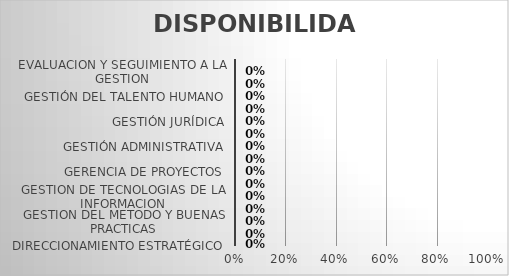
| Category | DISPONIBILIDAD |
|---|---|
| DIRECCIONAMIENTO ESTRATÉGICO | 0 |
| GESTIÓN DE PROVEEDORES | 0 |
| GESTION DEL METODO Y BUENAS PRACTICAS | 0 |
| GESTION DE COMUNICACIONES | 0 |
| GESTION DE TECNOLOGIAS DE LA INFORMACION | 0 |
| ESTRUCTURACION DE PROYECTOS | 0 |
| GERENCIA DE PROYECTOS | 0 |
| EVALUACION DE PROYECTOS | 0 |
| GESTIÓN ADMINISTRATIVA | 0 |
| GESTIÓN DEL RIESGO | 0 |
| GESTIÓN JURÍDICA | 0 |
| GESTIÓN FINANCIERA | 0 |
| GESTIÓN DEL TALENTO HUMANO | 0 |
| AUDITORIA INTERNA | 0 |
| EVALUACION Y SEGUIMIENTO A LA GESTION | 0 |